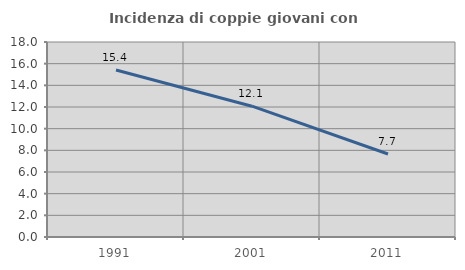
| Category | Incidenza di coppie giovani con figli |
|---|---|
| 1991.0 | 15.414 |
| 2001.0 | 12.075 |
| 2011.0 | 7.659 |